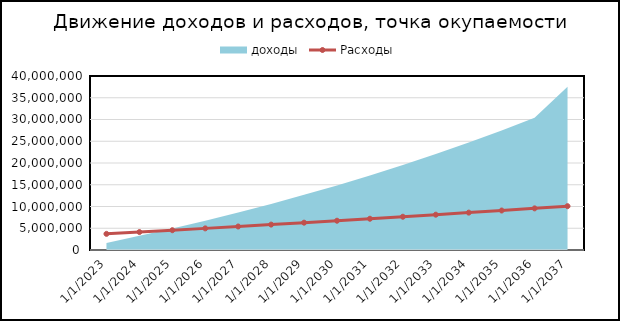
| Category | Расходы |
|---|---|
| 9/1/23 | 3710470 |
| 9/1/24 | 4125940 |
| 9/1/25 | 4546283.5 |
| 9/1/26 | 4971744.175 |
| 9/1/27 | 5402577.884 |
| 9/1/28 | 5839053.278 |
| 9/1/29 | 6281452.442 |
| 9/1/30 | 6730071.564 |
| 9/1/31 | 7185221.642 |
| 9/1/32 | 7647229.224 |
| 9/1/33 | 8116437.185 |
| 9/1/34 | 8593205.545 |
| 9/1/35 | 9077912.322 |
| 9/1/36 | 9570954.438 |
| 9/1/37 | 10072748.66 |